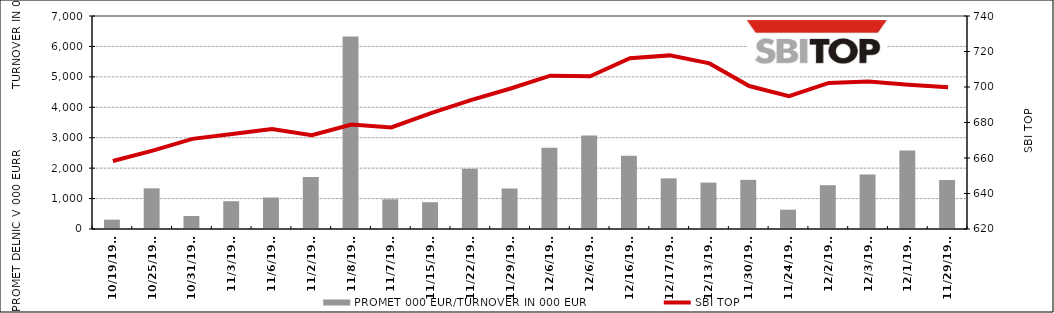
| Category | PROMET 000 EUR/TURNOVER IN 000 EUR |
|---|---|
| 10/19/01 | 308 |
| 10/25/01 | 1337 |
| 10/31/01 | 428 |
| 11/3/01 | 913 |
| 11/6/01 | 1034 |
| 11/2/01 | 1711 |
| 11/8/01 | 6327 |
| 11/7/01 | 977 |
| 11/15/01 | 880 |
| 11/22/01 | 1978 |
| 11/29/01 | 1332 |
| 12/6/01 | 2667 |
| 12/6/01 | 3071 |
| 12/16/01 | 2409 |
| 12/17/01 | 1665 |
| 12/13/01 | 1525 |
| 11/30/01 | 1615 |
| 11/24/01 | 634 |
| 12/2/01 | 1439 |
| 12/3/01 | 1795 |
| 12/1/01 | 2578 |
| 11/29/01 | 1612 |